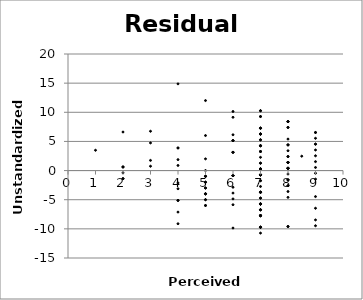
| Category | RES |
|---|---|
| 7.0 | -6.728 |
| 7.0 | -7.728 |
| 5.0 | -2.991 |
| 7.0 | -6.728 |
| 5.0 | -3.991 |
| 8.0 | 0.403 |
| 7.0 | -5.728 |
| 6.0 | -5.859 |
| 5.0 | 2.009 |
| 5.0 | -0.991 |
| 7.0 | -7.728 |
| 6.0 | -4.859 |
| 9.0 | -0.465 |
| 2.0 | -1.385 |
| 5.0 | 12.009 |
| 6.0 | -0.859 |
| 7.0 | -10.728 |
| 7.0 | -5.728 |
| 4.0 | -9.122 |
| 7.0 | 2.272 |
| 7.0 | -3.728 |
| 7.0 | -9.728 |
| 5.0 | -1.991 |
| 7.0 | -0.728 |
| 3.0 | 0.747 |
| 8.0 | 0.403 |
| 8.0 | -9.597 |
| 8.0 | 4.403 |
| 6.0 | -9.859 |
| 4.0 | 1.878 |
| 5.0 | -3.991 |
| 5.0 | -0.991 |
| 2.0 | 6.615 |
| 5.0 | 0.009 |
| 9.0 | 0.535 |
| 8.0 | 1.403 |
| 9.0 | 1.535 |
| 8.0 | -4.597 |
| 7.0 | -0.728 |
| 2.0 | -0.385 |
| 7.0 | -1.728 |
| 4.0 | -5.122 |
| 4.0 | 0.878 |
| 6.0 | -0.859 |
| 8.0 | 5.403 |
| 6.0 | -3.859 |
| 4.0 | 3.878 |
| 6.0 | 3.141 |
| 8.0 | 0.403 |
| 5.0 | -4.991 |
| 7.0 | -0.728 |
| 8.0 | 3.403 |
| 3.0 | 4.747 |
| 8.0 | -2.597 |
| 8.0 | -1.597 |
| 7.0 | -3.728 |
| 7.0 | -3.728 |
| 7.0 | -3.728 |
| 7.0 | 0.272 |
| 7.0 | -7.728 |
| 7.0 | 1.272 |
| 4.0 | -3.122 |
| 8.0 | 8.403 |
| 8.0 | 0.403 |
| 8.0 | 7.403 |
| 8.0 | -1.597 |
| 7.0 | -7.728 |
| 7.0 | 0.272 |
| 5.0 | -5.991 |
| 7.0 | -6.728 |
| 6.0 | 5.141 |
| 2.0 | 0.615 |
| 5.0 | 6.009 |
| 7.0 | -5.728 |
| 5.0 | -5.991 |
| 7.0 | -5.728 |
| 7.0 | -0.728 |
| 7.0 | -2.728 |
| 5.0 | -0.991 |
| 3.0 | 1.747 |
| 7.0 | 3.272 |
| 6.0 | -2.859 |
| 7.0 | -5.728 |
| 7.0 | 4.272 |
| 7.0 | 0.272 |
| 7.0 | 6.272 |
| 6.0 | -0.859 |
| 8.0 | 2.403 |
| 8.0 | -2.597 |
| 7.0 | 7.272 |
| 9.0 | 5.535 |
| 8.0 | 1.403 |
| 7.0 | -1.728 |
| 9.0 | 4.535 |
| 8.0 | 8.403 |
| 9.0 | -6.465 |
| 7.0 | -0.728 |
| 9.0 | 3.535 |
| 9.0 | 6.535 |
| 8.0 | 4.403 |
| 8.5 | 2.469 |
| 7.0 | 9.272 |
| 6.0 | 5.141 |
| 9.0 | -9.465 |
| 3.0 | 6.747 |
| 8.0 | 0.403 |
| 7.0 | 7.272 |
| 6.0 | 3.141 |
| 4.0 | -7.122 |
| 5.0 | -2.991 |
| 7.0 | -9.728 |
| 8.0 | -9.597 |
| 5.0 | -1.991 |
| 7.0 | -9.728 |
| 9.0 | -4.465 |
| 7.0 | 6.272 |
| 4.0 | 3.878 |
| 8.0 | 4.403 |
| 7.0 | -7.728 |
| 7.0 | -3.728 |
| 7.0 | 1.272 |
| 6.0 | 10.141 |
| 7.0 | 6.272 |
| 7.0 | 7.272 |
| 7.0 | 4.272 |
| 8.0 | 2.403 |
| 7.0 | 5.272 |
| 7.0 | 9.272 |
| 8.0 | 1.403 |
| 7.0 | 10.272 |
| 6.0 | 9.141 |
| 4.0 | -5.122 |
| 9.0 | 4.535 |
| 7.0 | 6.272 |
| 7.0 | 10.272 |
| 9.0 | 6.535 |
| 7.0 | 4.272 |
| 8.0 | 1.403 |
| 7.0 | 0.272 |
| 6.0 | -0.859 |
| 8.0 | -3.597 |
| 9.0 | -1.465 |
| 1.0 | 3.484 |
| 9.0 | 2.535 |
| 5.0 | -4.991 |
| 9.0 | -8.465 |
| 6.0 | 6.141 |
| 7.0 | -4.728 |
| 7.0 | -9.728 |
| 7.0 | 4.272 |
| 7.0 | -7.728 |
| 5.0 | -3.991 |
| 7.0 | 0.272 |
| 8.0 | -0.597 |
| 2.0 | -1.385 |
| 6.0 | 3.141 |
| 7.0 | -4.728 |
| 4.0 | -2.122 |
| 8.0 | -1.597 |
| 2.0 | 0.615 |
| 7.0 | 5.272 |
| 8.0 | 8.403 |
| 7.0 | 3.272 |
| 4.0 | 14.878 |
| 8.0 | 7.403 |
| 7.0 | 3.272 |
| 6.0 | 5.141 |
| 2.0 | 0.615 |